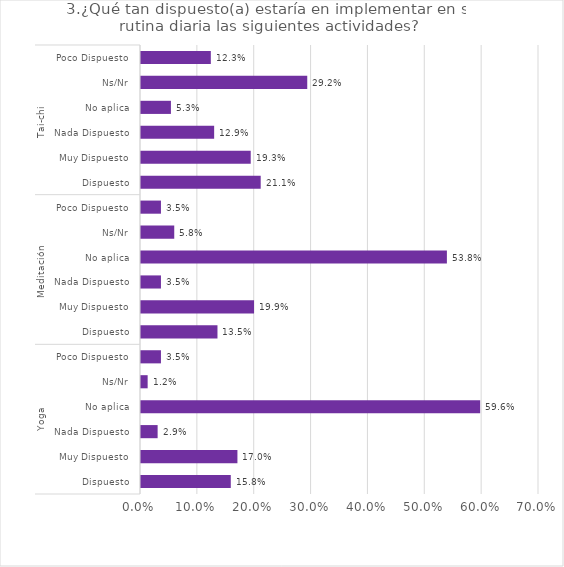
| Category | Series 0 |
|---|---|
| 0 | 0.158 |
| 1 | 0.17 |
| 2 | 0.029 |
| 3 | 0.596 |
| 4 | 0.012 |
| 5 | 0.035 |
| 6 | 0.135 |
| 7 | 0.199 |
| 8 | 0.035 |
| 9 | 0.538 |
| 10 | 0.058 |
| 11 | 0.035 |
| 12 | 0.211 |
| 13 | 0.193 |
| 14 | 0.129 |
| 15 | 0.053 |
| 16 | 0.292 |
| 17 | 0.123 |